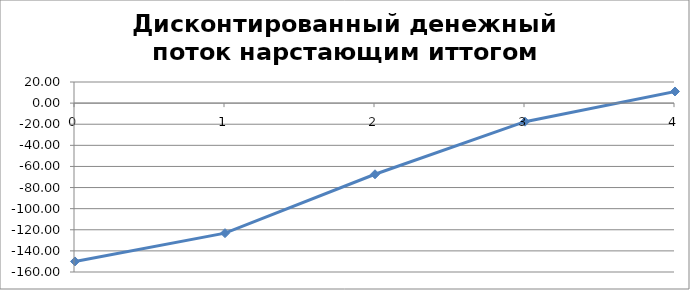
| Category | Дисконтированный денежный поток нарстающим иттогом |
|---|---|
| 0.0 | -150 |
| 1.0 | -123.214 |
| 2.0 | -67.411 |
| 3.0 | -17.586 |
| 4.0 | 11.012 |